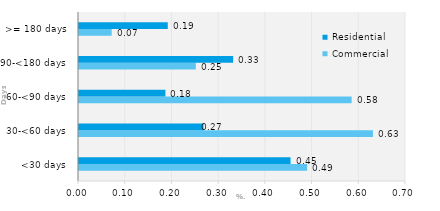
| Category | Commercial | Residential |
|---|---|---|
| <30 days | 0.488 | 0.453 |
| 30-<60 days | 0.629 | 0.266 |
| 60-<90 days | 0.584 | 0.185 |
| 90-<180 days | 0.25 | 0.33 |
| >= 180 days | 0.07 | 0.19 |